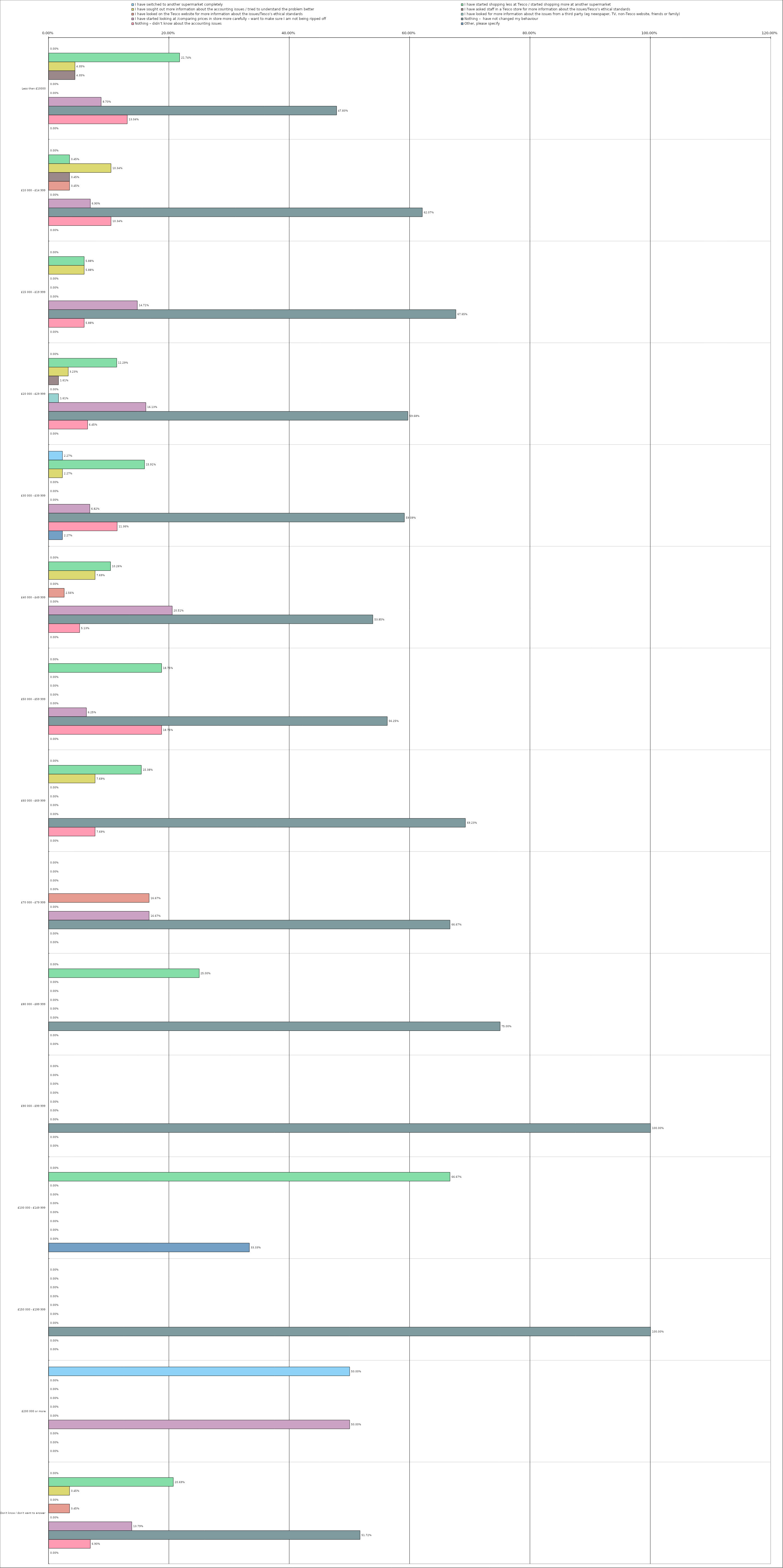
| Category | I have switched to another supermarket completely | I have started shopping less at Tesco / started shopping more at another supermarket | I have sought out more information about the accounting issues / tried to understand the problem better | I have asked staff in a Tesco store for more information about the issues/Tesco’s ethical standards | I have looked on the Tesco website for more information about the issues/Tesco’s ethical standards | I have looked for more information about the issues from a third party (eg newspaper, TV, non-Tesco website, friends or family) | I have started looking at /comparing prices in store more carefully – want to make sure I am not being ripped off | Nothing –  have not changed my behaviour | Nothing – didn’t know about the accounting issues | Other, please specify |
|---|---|---|---|---|---|---|---|---|---|---|
| 0 | 0 | 0.217 | 0.044 | 0.044 | 0 | 0 | 0.087 | 0.478 | 0.13 | 0 |
| 1 | 0 | 0.034 | 0.103 | 0.034 | 0.034 | 0 | 0.069 | 0.621 | 0.103 | 0 |
| 2 | 0 | 0.059 | 0.059 | 0 | 0 | 0 | 0.147 | 0.676 | 0.059 | 0 |
| 3 | 0 | 0.113 | 0.032 | 0.016 | 0 | 0.016 | 0.161 | 0.597 | 0.064 | 0 |
| 4 | 0.023 | 0.159 | 0.023 | 0 | 0 | 0 | 0.068 | 0.591 | 0.114 | 0.023 |
| 5 | 0 | 0.103 | 0.077 | 0 | 0.026 | 0 | 0.205 | 0.538 | 0.051 | 0 |
| 6 | 0 | 0.188 | 0 | 0 | 0 | 0 | 0.062 | 0.562 | 0.188 | 0 |
| 7 | 0 | 0.154 | 0.077 | 0 | 0 | 0 | 0 | 0.692 | 0.077 | 0 |
| 8 | 0 | 0 | 0 | 0 | 0.167 | 0 | 0.167 | 0.667 | 0 | 0 |
| 9 | 0 | 0.25 | 0 | 0 | 0 | 0 | 0 | 0.75 | 0 | 0 |
| 10 | 0 | 0 | 0 | 0 | 0 | 0 | 0 | 1 | 0 | 0 |
| 11 | 0 | 0.667 | 0 | 0 | 0 | 0 | 0 | 0 | 0 | 0.333 |
| 12 | 0 | 0 | 0 | 0 | 0 | 0 | 0 | 1 | 0 | 0 |
| 13 | 0.5 | 0 | 0 | 0 | 0 | 0 | 0.5 | 0 | 0 | 0 |
| 14 | 0 | 0.207 | 0.034 | 0 | 0.034 | 0 | 0.138 | 0.517 | 0.069 | 0 |